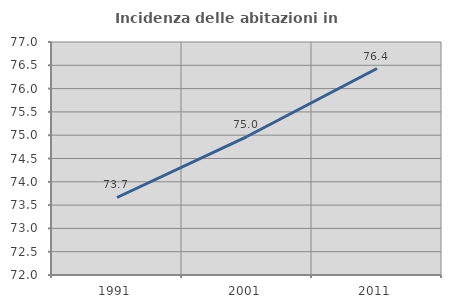
| Category | Incidenza delle abitazioni in proprietà  |
|---|---|
| 1991.0 | 73.663 |
| 2001.0 | 74.971 |
| 2011.0 | 76.431 |